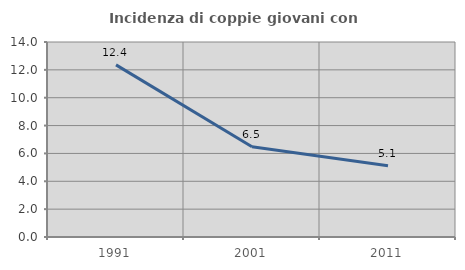
| Category | Incidenza di coppie giovani con figli |
|---|---|
| 1991.0 | 12.359 |
| 2001.0 | 6.481 |
| 2011.0 | 5.121 |